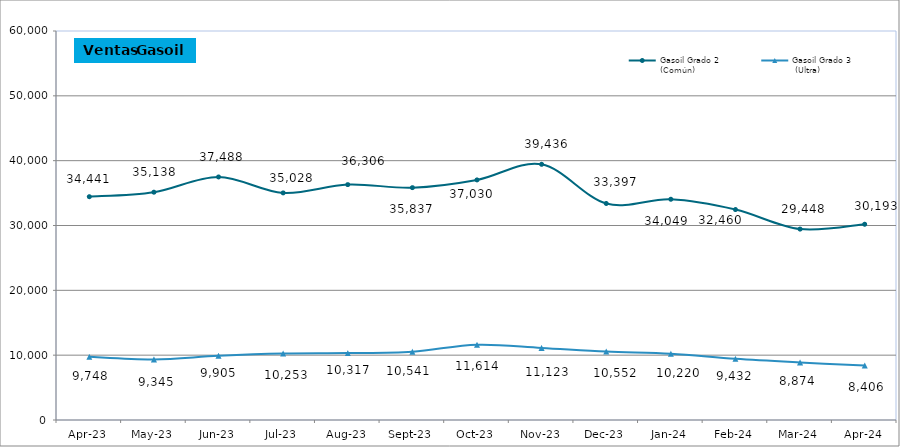
| Category | Gasoil Grado 2
(Común) | Gasoil Grado 3
 (Ultra)  |
|---|---|---|
| 2023-04-01 | 34440.83 | 9748.48 |
| 2023-05-01 | 35137.68 | 9345.26 |
| 2023-06-01 | 37488.31 | 9904.61 |
| 2023-07-01 | 35028.11 | 10252.91 |
| 2023-08-01 | 36305.95 | 10317.13 |
| 2023-09-01 | 35836.72 | 10540.82 |
| 2023-10-01 | 37030.076 | 11613.917 |
| 2023-11-01 | 39436.095 | 11122.546 |
| 2023-12-01 | 33396.735 | 10552.25 |
| 2024-01-01 | 34048.652 | 10220.007 |
| 2024-02-01 | 32460.117 | 9432.191 |
| 2024-03-01 | 29448.25 | 8873.71 |
| 2024-04-01 | 30193.4 | 8405.53 |